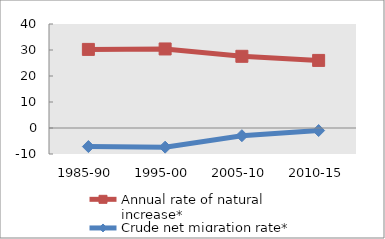
| Category | Annual rate of natural increase* | Crude net migration rate* |
|---|---|---|
| 1985-90 | 30.231 | -7.139 |
| 1995-00 | 30.4 | -7.363 |
| 2005-10 | 27.574 | -2.961 |
| 2010-15 | 25.996 | -0.98 |